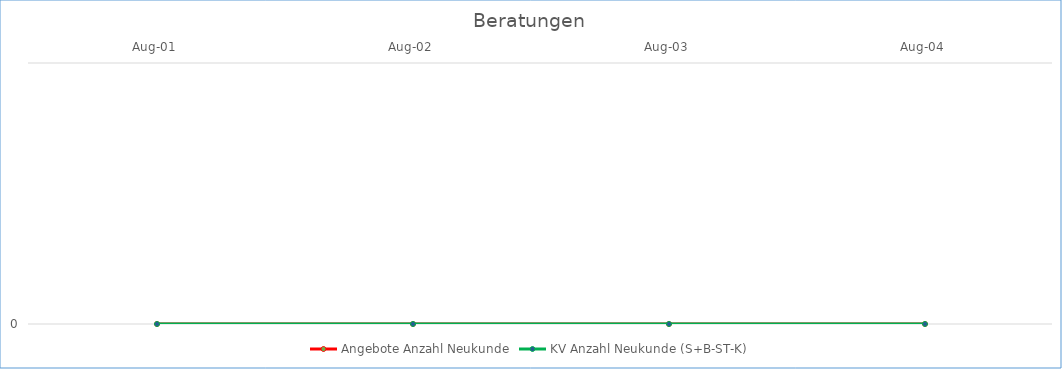
| Category | Angebote Anzahl Neukunde | KV Anzahl Neukunde (S+B-ST-K) |
|---|---|---|
| 2001-08-01 | 0 | 0 |
| 2002-08-01 | 0 | 0 |
| 2003-08-01 | 0 | 0 |
| 2004-08-01 | 0 | 0 |